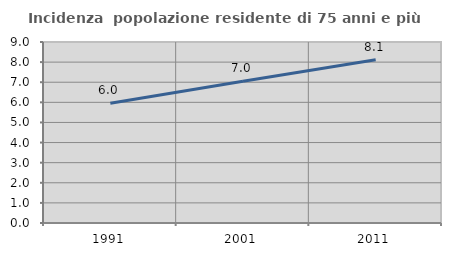
| Category | Incidenza  popolazione residente di 75 anni e più |
|---|---|
| 1991.0 | 5.952 |
| 2001.0 | 7.044 |
| 2011.0 | 8.115 |